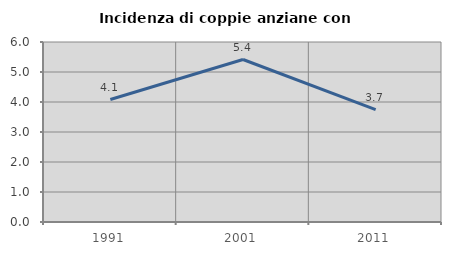
| Category | Incidenza di coppie anziane con figli |
|---|---|
| 1991.0 | 4.082 |
| 2001.0 | 5.417 |
| 2011.0 | 3.743 |